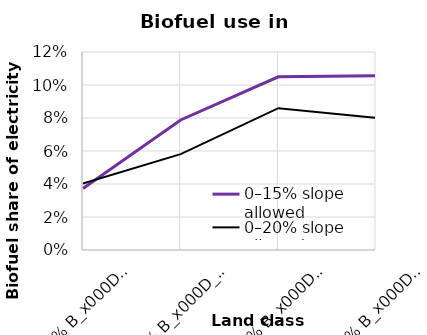
| Category | 0–15% slope allowed | 0–20% slope allowed |
|---|---|---|
| 100% B_x000d_100% C | 0.037 | 0.04 |
| 10% B_x000d_10% C | 0.079 | 0.058 |
| 1.8% B_x000d_1.1% C | 0.105 | 0.086 |
| 1.8% B_x000d_1.1% C_x000d_no new wind | 0.106 | 0.08 |